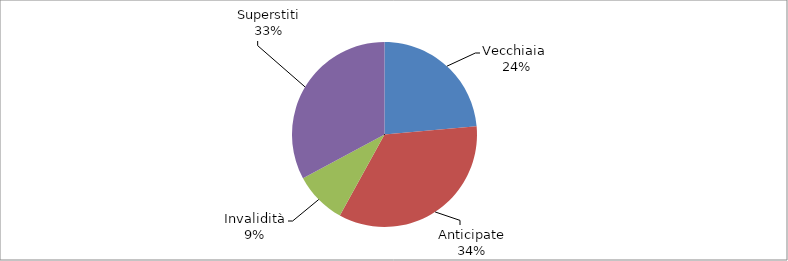
| Category | Series 0 |
|---|---|
| Vecchiaia  | 87381 |
| Anticipate | 127758 |
| Invalidità | 33947 |
| Superstiti | 121751 |